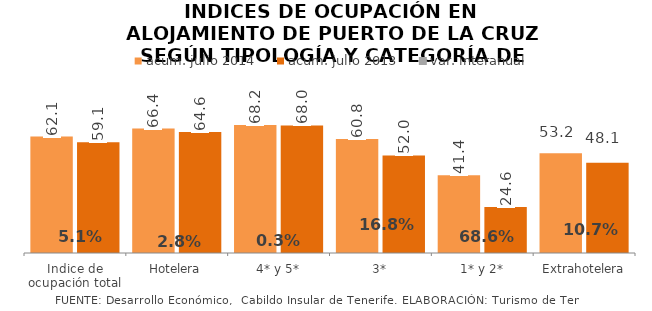
| Category | acum. julio 2014 | acum. julio 2013 |
|---|---|---|
| Indice de ocupación total | 62.093 | 59.108 |
| Hotelera | 66.397 | 64.578 |
| 4* y 5* | 68.218 | 68.008 |
| 3* | 60.777 | 52.018 |
| 1* y 2* | 41.417 | 24.565 |
| Extrahotelera | 53.225 | 48.101 |